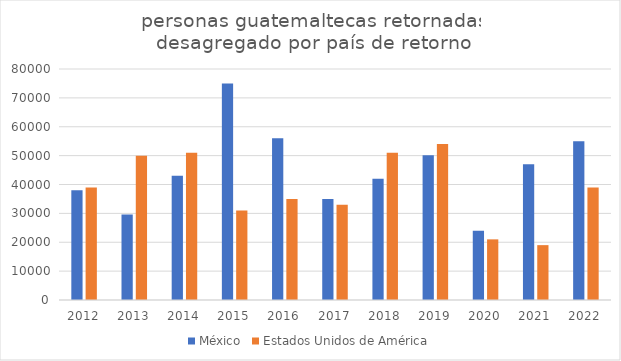
| Category | México | Estados Unidos de América |
|---|---|---|
| 2012.0 | 38000 | 39000 |
| 2013.0 | 29600 | 50000 |
| 2014.0 | 43000 | 51000 |
| 2015.0 | 75000 | 31000 |
| 2016.0 | 56000 | 35000 |
| 2017.0 | 35000 | 33000 |
| 2018.0 | 42000 | 51000 |
| 2019.0 | 50100 | 54000 |
| 2020.0 | 24000 | 21000 |
| 2021.0 | 47000 | 19000 |
| 2022.0 | 55000 | 39000 |